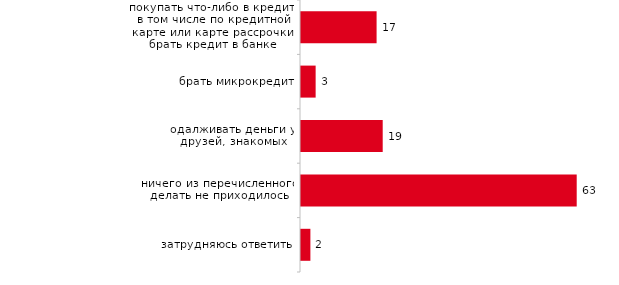
| Category | Series 0 |
|---|---|
| покупать что-либо в кредит, в том числе по кредитной карте или карте рассрочки, брать кредит в банке | 17.18 |
| брать микрокредит | 3.327 |
| одалживать деньги у друзей, знакомых | 18.57 |
| ничего из перечисленного делать не приходилось | 62.661 |
| затрудняюсь ответить | 2.135 |